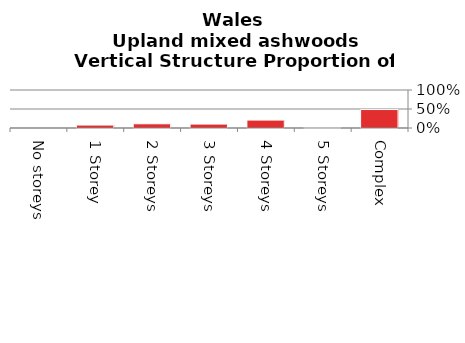
| Category | Upland mixed ashwoods |
|---|---|
| No storeys | 0 |
| 1 Storey | 0.077 |
| 2 Storeys | 0.111 |
| 3 Storeys | 0.103 |
| 4 Storeys | 0.208 |
| 5 Storeys | 0.015 |
| Complex | 0.486 |